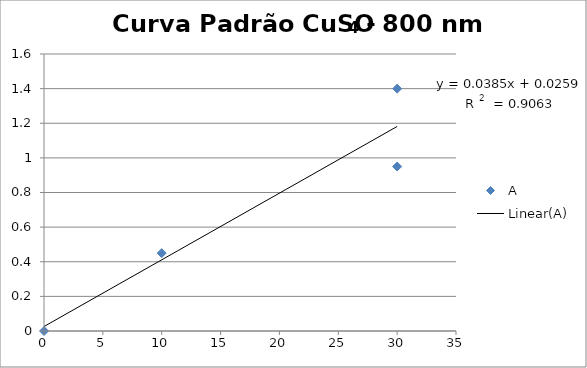
| Category | A |
|---|---|
| 0.0 | 0 |
| 10.0 | 0.45 |
| 30.0 | 0.95 |
| 30.0 | 1.4 |